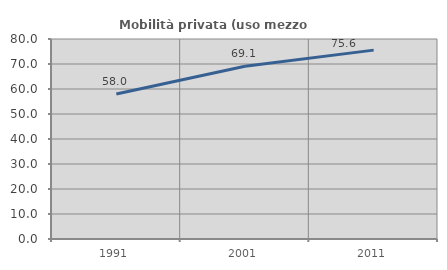
| Category | Mobilità privata (uso mezzo privato) |
|---|---|
| 1991.0 | 57.993 |
| 2001.0 | 69.125 |
| 2011.0 | 75.554 |